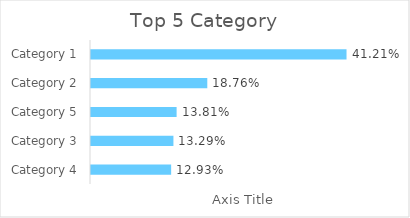
| Category | Total |
|---|---|
| Category 4 | 0.129 |
| Category 3 | 0.133 |
| Category 5 | 0.138 |
| Category 2 | 0.188 |
| Category 1 | 0.412 |